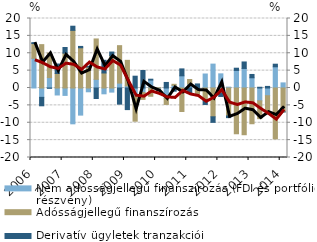
| Category | Nem adósságjellegű finanszírozás (FDI és portfólió részvény) | Adósságjellegű finanszírozás | Derivatív ügyletek tranzakciói |
|---|---|---|---|
| 2006.0 | 8.543 | 4.248 | 0.258 |
| 2006.0 | -2.691 | 12.48 | -2.43 |
| 2006.0 | 2.993 | 7.06 | -0.083 |
| 2006.0 | -2.011 | 4.176 | 2.728 |
| 2007.0 | -2.131 | 10.022 | 1.629 |
| 2007.0 | -10.309 | 16.592 | 1.187 |
| 2007.0 | -7.803 | 11.578 | 0.386 |
| 2007.0 | -1.089 | 6.05 | 0.178 |
| 2008.0 | 2.491 | 11.626 | -3.029 |
| 2008.0 | -1.671 | 4.319 | 3.653 |
| 2008.0 | -1.182 | 9.293 | 1.056 |
| 2008.0 | 1.4 | 10.785 | -4.644 |
| 2009.0 | 0.6 | 7.362 | -6.214 |
| 2009.0 | -2.401 | -7.151 | 3.397 |
| 2009.0 | -1.308 | -1.969 | 5.042 |
| 2009.0 | 2.282 | -2.383 | 0.25 |
| 2010.0 | -0.739 | 0.063 | -0.117 |
| 2010.0 | -2.991 | -1.739 | 1.598 |
| 2010.0 | 0.754 | 0.308 | -0.915 |
| 2010.0 | 3.507 | -6.756 | 1.989 |
| 2011.0 | 1.152 | 1.292 | -1.451 |
| 2011.0 | -0.235 | -1.539 | 1.172 |
| 2011.0 | 4.027 | -3.334 | -1.406 |
| 2011.0 | 6.874 | -8.287 | -1.6 |
| 2012.0 | 4.073 | -1.446 | -0.99 |
| 2012.0 | 0.247 | -8.035 | -0.491 |
| 2012.0 | 5.056 | -13.171 | 0.641 |
| 2012.0 | 5.625 | -13.446 | 1.866 |
| 2013.0 | 2.944 | -10.285 | 0.952 |
| 2013.0 | -3.692 | -5.134 | 0.215 |
| 2013.0 | -2.22 | -5.198 | 0.457 |
| 2013.0 | 6.105 | -14.643 | 0.745 |
| 2014.0 | 1.469 | -6.865 | -0.021 |